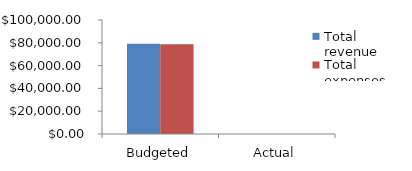
| Category | Total revenue | Total expenses |
|---|---|---|
| Budgeted | 79060 | 78800 |
| Actual | 0 | 0 |